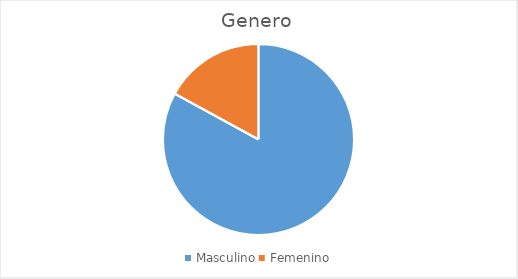
| Category | Series 0 |
|---|---|
| Masculino | 73 |
| Femenino | 15 |